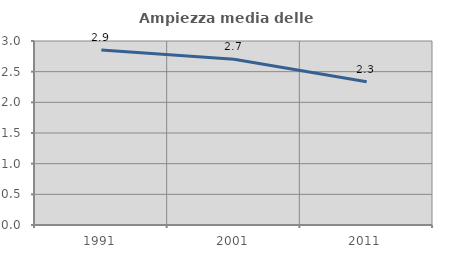
| Category | Ampiezza media delle famiglie |
|---|---|
| 1991.0 | 2.853 |
| 2001.0 | 2.703 |
| 2011.0 | 2.335 |